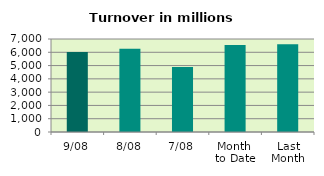
| Category | Series 0 |
|---|---|
| 9/08 | 6028.456 |
| 8/08 | 6267.359 |
| 7/08 | 4884.039 |
| Month 
to Date | 6539.284 |
| Last
Month | 6596.564 |